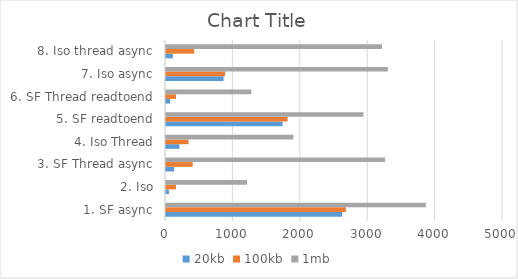
| Category | 20kb | 100kb | 1mb |
|---|---|---|---|
| 1. SF async | 2615 | 2668 | 3855 |
| 2. Iso | 44 | 148 | 1202 |
| 3. SF Thread async | 121 | 396 | 3250 |
| 4. Iso Thread | 199 | 334 | 1889 |
| 5. SF readtoend | 1730 | 1804 | 2930 |
| 6. SF Thread readtoend | 62 | 149 | 1265 |
| 7. Iso async | 854 | 877 | 3292 |
| 8. Iso thread async | 102 | 419 | 3205 |